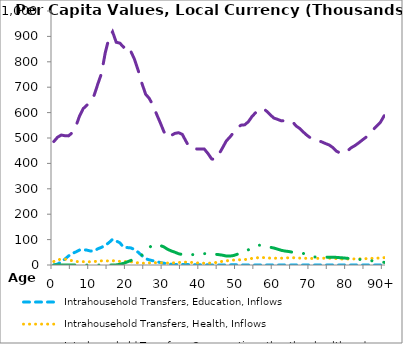
| Category | Intrahousehold Transfers, Education, Inflows | Intrahousehold Transfers, Health, Inflows | Intrahousehold Transfers, Consumption other than health and education, Inflows | Intrahousehold Transfers, Saving, Inflows |
|---|---|---|---|---|
| 0 | 0 | 14045.673 | 486022.655 | 0 |
|  | 3443.477 | 20007.685 | 502923.97 | 0 |
| 2 | 12335.496 | 23201.772 | 511597.362 | 0 |
| 3 | 23034.227 | 23207.261 | 509107.334 | 0 |
| 4 | 35490.377 | 20435.831 | 508347.037 | 0 |
| 5 | 45566.785 | 16764.742 | 520542.901 | 0 |
| 6 | 51356.952 | 13819.726 | 545777.18 | 0 |
| 7 | 59007.501 | 13211.226 | 586462.815 | 0 |
| 8 | 60459.326 | 13043.594 | 615634.774 | 0 |
| 9 | 58567.062 | 12932.886 | 629020.708 | 0 |
| 10 | 54924.453 | 12430.753 | 646340.684 | 0 |
| 11 | 55712.884 | 13419.308 | 668782.249 | 0 |
| 12 | 63869.653 | 15864.683 | 713290.686 | 0 |
| 13 | 69561.057 | 16314.685 | 754478.447 | 0 |
| 14 | 77511.363 | 16181.735 | 835220.64 | 0 |
| 15 | 87894.64 | 16042.319 | 892404.04 | 0.063 |
| 16 | 101082.29 | 16928.84 | 917955.26 | 6.144 |
| 17 | 94643.738 | 15161.476 | 876976.6 | 294.225 |
| 18 | 87228.388 | 14164.987 | 873410.32 | 2930.826 |
| 19 | 69706.983 | 12977.576 | 857535.72 | 6444.967 |
| 20 | 68676.683 | 14035.284 | 865716.82 | 12190.408 |
| 21 | 67231.64 | 12800.9 | 840581.95 | 17840.573 |
| 22 | 60686.186 | 10415.24 | 809096.4 | 24079.369 |
| 23 | 49924.509 | 8265.976 | 765702.44 | 30038.751 |
| 24 | 36827.855 | 7272.098 | 715236.97 | 39671.182 |
| 25 | 25121.596 | 7039.645 | 672600.7 | 51811.914 |
| 26 | 20182.386 | 8119.038 | 655866.33 | 68389.774 |
| 27 | 16688.397 | 8796.335 | 628817.88 | 80477.88 |
| 28 | 13100.168 | 9051.872 | 593616.48 | 79356.827 |
| 29 | 9754.483 | 9076.887 | 560035.415 | 76710.699 |
| 30 | 7028.771 | 8140.25 | 524607.298 | 71159.526 |
| 31 | 4201.517 | 7623.49 | 501941.905 | 61756.443 |
| 32 | 3029.268 | 8197.154 | 510418.642 | 55354.105 |
| 33 | 2327.362 | 8606.714 | 518288.698 | 50250.651 |
| 34 | 2143.877 | 9739.035 | 520796.665 | 44248.92 |
| 35 | 2182.458 | 11229.819 | 514335.025 | 41365.711 |
| 36 | 1949.757 | 11335.63 | 487251.95 | 39743.838 |
| 37 | 1505.045 | 10439.826 | 462153.239 | 39958.999 |
| 38 | 1165.167 | 9730.371 | 461021.731 | 41019.303 |
| 39 | 844.489 | 8307.18 | 456613.505 | 42085.097 |
| 40 | 708.994 | 7252.813 | 457136.214 | 42627.267 |
| 41 | 639.212 | 6878.739 | 456335.726 | 44720.106 |
| 42 | 516.274 | 7068.239 | 438784.779 | 44383.739 |
| 43 | 452.647 | 7937.284 | 417558.91 | 44274.255 |
| 44 | 308.201 | 9425.126 | 414804.763 | 42399.471 |
| 45 | 304.849 | 11830.284 | 436672.926 | 40639.74 |
| 46 | 407.338 | 14578.228 | 462120.47 | 38564.76 |
| 47 | 563.128 | 16418.782 | 488674.484 | 35247.387 |
| 48 | 618.038 | 17838.644 | 504031.756 | 35177.477 |
| 49 | 623.799 | 19369.813 | 522092.72 | 37332.054 |
| 50 | 556.71 | 20347.141 | 540608.18 | 42478.214 |
| 51 | 453.144 | 20549.682 | 550591.61 | 49075.743 |
| 52 | 342.828 | 21317.45 | 551844.52 | 54314.661 |
| 53 | 196.729 | 23480.292 | 564074.05 | 59791.511 |
| 54 | 155.192 | 25973.184 | 584809.06 | 64347.86 |
| 55 | 53.319 | 27780.468 | 600050.81 | 72569.183 |
| 56 | 43.759 | 29195.87 | 612867.27 | 77955.884 |
| 57 | 47.72 | 29189.243 | 615841.83 | 77987.326 |
| 58 | 45.995 | 28286.615 | 605254.63 | 73974.06 |
| 59 | 43.38 | 27120.911 | 590666.47 | 69634.377 |
| 60 | 41.8 | 26720.536 | 578073.74 | 66581.631 |
| 61 | 39.801 | 26798.751 | 573198.87 | 62309.939 |
| 62 | 37.621 | 26880.638 | 567445.14 | 57658.632 |
| 63 | 34.329 | 27794.839 | 568145.76 | 54869.32 |
| 64 | 31.318 | 28458.121 | 565130.45 | 53142.685 |
| 65 | 29.529 | 28980.558 | 564513.08 | 50429.154 |
| 66 | 29.846 | 27477.635 | 547450.66 | 48400.681 |
| 67 | 30.961 | 27075.502 | 537340.77 | 47328.26 |
| 68 | 25.383 | 26538.178 | 523154.84 | 45147.843 |
| 69 | 0 | 26127.447 | 510261.6 | 42057.363 |
| 70 | 0 | 25962.757 | 499622.56 | 38149.71 |
| 71 | 0 | 25624.736 | 491238.78 | 31669.156 |
| 72 | 0 | 26140.429 | 489262.89 | 30893.01 |
| 73 | 0 | 26573.621 | 484632.59 | 30615.397 |
| 74 | 0 | 26778.567 | 478230.63 | 30855.697 |
| 75 | 0 | 26829.364 | 472610.38 | 30790.619 |
| 76 | 0 | 26341.997 | 462634.93 | 30424.633 |
| 77 | 0 | 25127.51 | 447907.99 | 29976.155 |
| 78 | 0 | 24023.916 | 441120.81 | 28792.941 |
| 79 | 0 | 23332.884 | 439417.88 | 27696.753 |
| 80 | 0 | 23523.703 | 449328.67 | 26282.509 |
| 81 | 0 | 23918.614 | 461444.47 | 24879.392 |
| 82 | 0 | 24026.697 | 469808.3 | 23618.527 |
| 83 | 0 | 24298.652 | 480150.28 | 22262.247 |
| 84 | 0 | 24668.992 | 491505.25 | 20839.699 |
| 85 | 0 | 25008.274 | 502483.9 | 19398.536 |
| 86 | 0 | 25616.756 | 517003.54 | 17731.478 |
| 87 | 0 | 26324.673 | 532801.32 | 15982.716 |
| 88 | 0 | 26919.614 | 547196.46 | 14292.34 |
| 89 | 0 | 27578.771 | 562472.48 | 12552.87 |
| 90+ | 0 | 29027.389 | 587523.28 | 10315.53 |